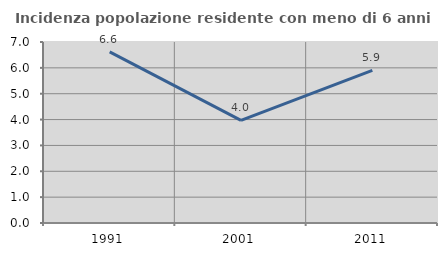
| Category | Incidenza popolazione residente con meno di 6 anni |
|---|---|
| 1991.0 | 6.619 |
| 2001.0 | 3.972 |
| 2011.0 | 5.903 |